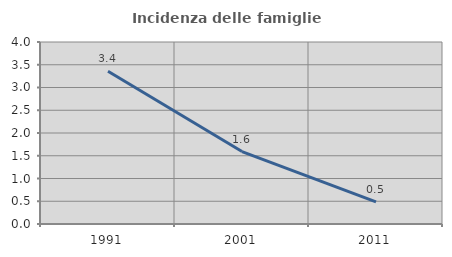
| Category | Incidenza delle famiglie numerose |
|---|---|
| 1991.0 | 3.358 |
| 2001.0 | 1.592 |
| 2011.0 | 0.485 |